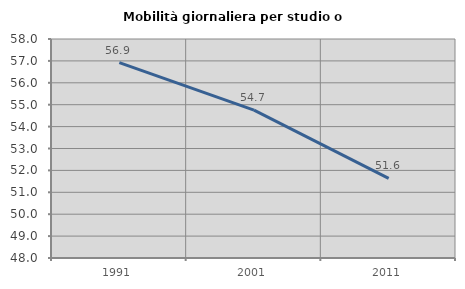
| Category | Mobilità giornaliera per studio o lavoro |
|---|---|
| 1991.0 | 56.921 |
| 2001.0 | 54.749 |
| 2011.0 | 51.638 |